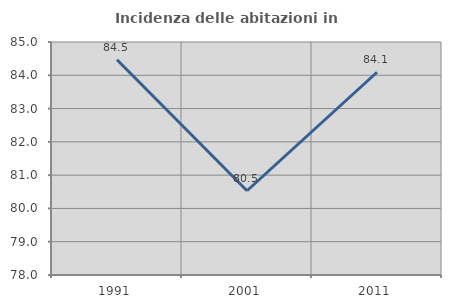
| Category | Incidenza delle abitazioni in proprietà  |
|---|---|
| 1991.0 | 84.466 |
| 2001.0 | 80.531 |
| 2011.0 | 84.091 |